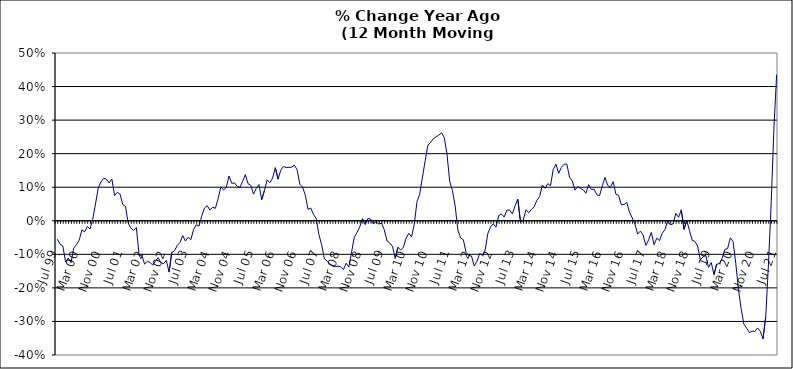
| Category | Series 0 |
|---|---|
| Jul 99 | -0.055 |
| Aug 99 | -0.07 |
| Sep 99 | -0.074 |
| Oct 99 | -0.123 |
| Nov 99 | -0.111 |
| Dec 99 | -0.125 |
| Jan 00 | -0.082 |
| Feb 00 | -0.071 |
| Mar 00 | -0.058 |
| Apr 00 | -0.027 |
| May 00 | -0.033 |
| Jun 00 | -0.017 |
| Jul 00 | -0.025 |
| Aug 00 | 0.005 |
| Sep 00 | 0.05 |
| Oct 00 | 0.098 |
| Nov 00 | 0.116 |
| Dec 00 | 0.127 |
| Jan 01 | 0.124 |
| Feb 01 | 0.113 |
| Mar 01 | 0.124 |
| Apr 01 | 0.075 |
| May 01 | 0.085 |
| Jun 01 | 0.08 |
| Jul 01 | 0.048 |
| Aug 01 | 0.043 |
| Sep 01 | -0.007 |
| Oct 01 | -0.022 |
| Nov 01 | -0.029 |
| Dec 01 | -0.02 |
| Jan 02 | -0.103 |
| Feb 02 | -0.102 |
| Mar 02 | -0.129 |
| Apr 02 | -0.121 |
| May 02 | -0.124 |
| Jun 02 | -0.132 |
| Jul 02 | -0.119 |
| Aug 02 | -0.11 |
| Sep 02 | -0.125 |
| Oct 02 | -0.128 |
| Nov 02 | -0.118 |
| Dec 02 | -0.153 |
| Jan 03 | -0.094 |
| Feb 03 | -0.09 |
| Mar 03 | -0.073 |
| Apr 03 | -0.065 |
| May 03 | -0.044 |
| Jun 03 | -0.06 |
| Jul 03 | -0.049 |
| Aug 03 | -0.056 |
| Sep 03 | -0.026 |
| Oct 03 | -0.012 |
| Nov 03 | -0.016 |
| Dec 03 | 0.014 |
| Jan 04 | 0.038 |
| Feb 04 | 0.045 |
| Mar 04 | 0.032 |
| Apr 04 | 0.041 |
| May 04 | 0.037 |
| Jun 04 | 0.066 |
| Jul 04 | 0.101 |
| Aug 04 | 0.092 |
| Sep 04 | 0.1 |
| Oct 04 | 0.133 |
| Nov 04 | 0.111 |
| Dec 04 | 0.113 |
| Jan 05 | 0.103 |
| Feb 05 | 0.1 |
| Mar 05 | 0.118 |
| Apr 05 | 0.138 |
| May 05 | 0.11 |
| Jun 05 | 0.106 |
| Jul 05 | 0.079 |
| Aug 05 | 0.097 |
| Sep 05 | 0.108 |
| Oct 05 | 0.063 |
| Nov 05 | 0.09 |
| Dec 05 | 0.122 |
| Jan 06 | 0.114 |
| Feb 06 | 0.127 |
| Mar 06 | 0.158 |
| Apr 06 | 0.124 |
| May 06 | 0.151 |
| Jun 06 | 0.162 |
| Jul 06 | 0.159 |
| Aug 06 | 0.159 |
| Sep 06 | 0.16 |
| Oct 06 | 0.166 |
| Nov 06 | 0.152 |
| Dec 06 | 0.109 |
| Jan 07 | 0.101 |
| Feb 07 | 0.076 |
| Mar 07 | 0.034 |
| Apr 07 | 0.038 |
| May 07 | 0.019 |
| Jun 07 | 0.007 |
| Jul 07 | -0.041 |
| Aug 07 | -0.071 |
| Sep 07 | -0.113 |
| Oct 07 | -0.12 |
| Nov 07 | -0.128 |
| Dec 07 | -0.135 |
| Jan 08 | -0.137 |
| Feb 08 | -0.135 |
| Mar 08 | -0.137 |
| Apr 08 | -0.145 |
| May 08 | -0.126 |
| Jun 08 | -0.138 |
| Jul 08 | -0.093 |
| Aug 08 | -0.049 |
| Sep-08 | -0.035 |
| Oct 08 | -0.018 |
| Nov 08 | 0.007 |
| Dec 08 | -0.011 |
| Jan 09 | 0.007 |
| Feb 09 | 0.005 |
| Mar 09 | -0.009 |
| Apr 09 | -0.003 |
| May 09 | -0.01 |
| Jun 09 | -0.007 |
| Jul 09 | -0.027 |
| Aug 09 | -0.06 |
| Sep 09 | -0.066 |
| Oct 09 | -0.076 |
| Nov 09 | -0.112 |
| Dec 09 | -0.079 |
| Jan 10 | -0.087 |
| Feb 10 | -0.079 |
| Mar 10 | -0.052 |
| Apr 10 | -0.037 |
| May 10 | -0.048 |
| Jun 10 | -0.01 |
| Jul 10 | 0.057 |
| Aug 10 | 0.08 |
| Sep 10 | 0.13 |
| Oct 10 | 0.179 |
| Nov 10 | 0.226 |
| Dec 10 | 0.233 |
| Jan 11 | 0.245 |
| Feb 11 | 0.25 |
| Mar 11 | 0.255 |
| Apr 11 | 0.262 |
| May 11 | 0.248 |
| Jun 11 | 0.199 |
| Jul 11 | 0.118 |
| Aug 11 | 0.09 |
| Sep 11 | 0.044 |
| Oct 11 | -0.028 |
| Nov 11 | -0.051 |
| Dec 11 | -0.056 |
| Jan 12 | -0.094 |
| Feb 12 | -0.104 |
| Mar 12 | -0.105 |
| Apr 12 | -0.134 |
| May 12 | -0.121 |
| Jun 12 | -0.098 |
| Jul 12 | -0.103 |
| Aug 12 | -0.087 |
| Sep 12 | -0.038 |
| Oct 12 | -0.018 |
| Nov 12 | -0.009 |
| Dec 12 | -0.019 |
| Jan 13 | 0.016 |
| Feb-13 | 0.02 |
| Mar-13 | 0.011 |
| Apr 13 | 0.032 |
| May 13 | 0.032 |
| Jun-13 | 0.021 |
| Jul 13 | 0.045 |
| Aug 13 | 0.065 |
| Sep 13 | -0.005 |
| Oct 13 | 0.002 |
| Nov 13 | 0.033 |
| Dec 13 | 0.024 |
| Jan 14 | 0.034 |
| Feb-14 | 0.042 |
| Mar 14 | 0.061 |
| Apr 14 | 0.072 |
| May 14 | 0.107 |
| Jun 14 | 0.097 |
| Jul-14 | 0.111 |
| Aug-14 | 0.105 |
| Sep 14 | 0.153 |
| Oct 14 | 0.169 |
| Nov 14 | 0.141 |
| Dec 14 | 0.159 |
| Jan 15 | 0.169 |
| Feb 15 | 0.169 |
| Mar 15 | 0.129 |
| Apr-15 | 0.118 |
| May 15 | 0.091 |
| Jun-15 | 0.102 |
| Jul 15 | 0.097 |
| Aug 15 | 0.092 |
| Sep 15 | 0.082 |
| Oct 15 | 0.108 |
| Nov 15 | 0.093 |
| Dec 15 | 0.094 |
| Jan 16 | 0.078 |
| Feb 16 | 0.075 |
| Mar 16 | 0.104 |
| Apr 16 | 0.129 |
| May 16 | 0.105 |
| Jun 16 | 0.1 |
| Jul 16 | 0.117 |
| Aug 16 | 0.08 |
| Sep 16 | 0.076 |
| Oct 16 | 0.048 |
| Nov 16 | 0.048 |
| Dec 16 | 0.055 |
| Jan 17 | 0.025 |
| Feb 17 | 0.009 |
| Mar 17 | -0.01 |
| Apr 17 | -0.04 |
| May 17 | -0.031 |
| Jun 17 | -0.042 |
| Jul 17 | -0.074 |
| Aug 17 | -0.057 |
| Sep 17 | -0.035 |
| Oct 17 | -0.071 |
| Nov 17 | -0.052 |
| Dec 17 | -0.059 |
| Jan 18 | -0.037 |
| Feb 18 | -0.027 |
| Mar 18 | 0 |
| Apr 18 | -0.012 |
| May 18 | -0.009 |
| Jun 18 | 0.022 |
| Jul 18 | 0.01 |
| Aug 18 | 0.033 |
| Sep 18 | -0.025 |
| Oct 18 | 0.002 |
| Nov 18 | -0.029 |
| Dec 18 | -0.058 |
| Jan 19 | -0.061 |
| Feb 19 | -0.075 |
| Mar 19 | -0.117 |
| Apr 19 | -0.107 |
| May 19 | -0.104 |
| Jun 19 | -0.139 |
| Jul 19 | -0.124 |
| Aug 19 | -0.16 |
| Sep 19 | -0.129 |
| Oct 19 | -0.128 |
| Nov 19 | -0.112 |
| Dec 19 | -0.085 |
| Jan 20 | -0.083 |
| Feb 20 | -0.051 |
| Mar 20 | -0.061 |
| Apr 20 | -0.127 |
| May 20 | -0.206 |
| Jun 20 | -0.264 |
| Jul 20 | -0.308 |
| Aug 20 | -0.32 |
| Sep 20 | -0.333 |
| Oct 20 | -0.329 |
| Nov 20 | -0.33 |
| Dec 20 | -0.319 |
| Jan 21 | -0.329 |
| Feb 21 | -0.352 |
| Mar 21 | -0.286 |
| Apr 21 | -0.129 |
| May 21 | 0.053 |
| Jun 21 | 0.276 |
| Jul 21 | 0.435 |